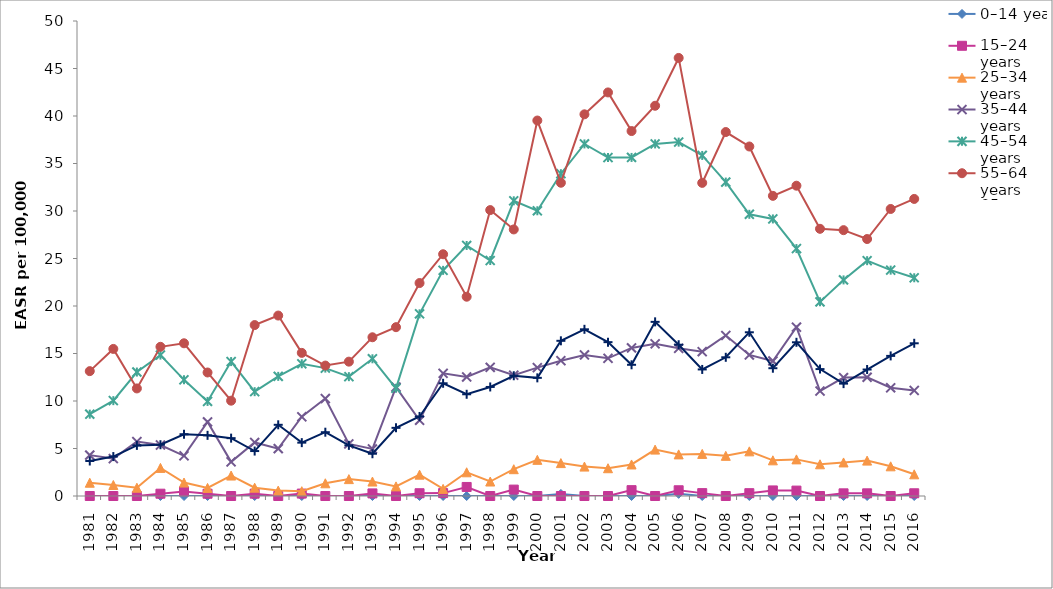
| Category | 0–14 years | 15–24 years | 25–34 years | 35–44 years | 45–54 years | 55–64 years | 65 + years |
|---|---|---|---|---|---|---|---|
| 1981.0 | 0 | 0 | 1.397 | 4.303 | 8.614 | 13.143 | 3.685 |
| 1982.0 | 0 | 0 | 1.158 | 3.937 | 10.037 | 15.481 | 4.151 |
| 1983.0 | 0 | 0 | 0.87 | 5.726 | 13.048 | 11.323 | 5.327 |
| 1984.0 | 0 | 0.242 | 2.958 | 5.368 | 14.832 | 15.704 | 5.398 |
| 1985.0 | 0 | 0.479 | 1.415 | 4.232 | 12.229 | 16.076 | 6.503 |
| 1986.0 | 0 | 0.241 | 0.85 | 7.799 | 9.955 | 13.001 | 6.385 |
| 1987.0 | 0 | 0 | 2.152 | 3.591 | 14.149 | 10.034 | 6.09 |
| 1988.0 | 0 | 0.246 | 0.874 | 5.637 | 10.982 | 17.993 | 4.731 |
| 1989.0 | 0 | 0 | 0.567 | 4.987 | 12.594 | 18.994 | 7.494 |
| 1990.0 | 0 | 0.255 | 0.507 | 8.344 | 13.92 | 15.066 | 5.616 |
| 1991.0 | 0 | 0 | 1.338 | 10.259 | 13.464 | 13.73 | 6.715 |
| 1992.0 | 0 | 0 | 1.777 | 5.479 | 12.563 | 14.142 | 5.33 |
| 1993.0 | 0 | 0.272 | 1.521 | 4.952 | 14.444 | 16.71 | 4.449 |
| 1994.0 | 0 | 0 | 1.012 | 11.461 | 11.338 | 17.771 | 7.174 |
| 1995.0 | 0 | 0.292 | 2.246 | 7.968 | 19.175 | 22.418 | 8.372 |
| 1996.0 | 0 | 0.305 | 0.75 | 12.911 | 23.754 | 25.449 | 11.865 |
| 1997.0 | 0 | 0.951 | 2.496 | 12.531 | 26.37 | 20.976 | 10.707 |
| 1998.0 | 0 | 0 | 1.524 | 13.541 | 24.79 | 30.096 | 11.478 |
| 1999.0 | 0 | 0.674 | 2.822 | 12.715 | 31.073 | 28.059 | 12.658 |
| 2000.0 | 0 | 0 | 3.804 | 13.515 | 30.025 | 39.524 | 12.437 |
| 2001.0 | 0.219 | 0 | 3.463 | 14.245 | 33.925 | 32.974 | 16.336 |
| 2002.0 | 0 | 0 | 3.096 | 14.85 | 37.059 | 40.178 | 17.546 |
| 2003.0 | 0 | 0 | 2.923 | 14.492 | 35.625 | 42.481 | 16.194 |
| 2004.0 | 0 | 0.616 | 3.32 | 15.586 | 35.639 | 38.416 | 13.811 |
| 2005.0 | 0 | 0 | 4.882 | 16.017 | 37.061 | 41.077 | 18.331 |
| 2006.0 | 0.226 | 0.604 | 4.378 | 15.544 | 37.25 | 46.112 | 15.922 |
| 2007.0 | 0 | 0.303 | 4.431 | 15.193 | 35.848 | 32.96 | 13.323 |
| 2008.0 | 0 | 0 | 4.228 | 16.895 | 33.046 | 38.311 | 14.601 |
| 2009.0 | 0 | 0.297 | 4.7 | 14.848 | 29.652 | 36.79 | 17.233 |
| 2010.0 | 0 | 0.586 | 3.754 | 14.208 | 29.164 | 31.595 | 13.451 |
| 2011.0 | 0 | 0.569 | 3.854 | 17.773 | 26.045 | 32.662 | 16.179 |
| 2012.0 | 0 | 0 | 3.338 | 11.047 | 20.435 | 28.125 | 13.36 |
| 2013.0 | 0 | 0.281 | 3.533 | 12.466 | 22.746 | 27.985 | 11.829 |
| 2014.0 | 0 | 0.282 | 3.725 | 12.494 | 24.77 | 27.05 | 13.313 |
| 2015.0 | 0 | 0 | 3.125 | 11.393 | 23.774 | 30.214 | 14.747 |
| 2016.0 | 0 | 0.286 | 2.282 | 11.109 | 22.972 | 31.271 | 16.076 |